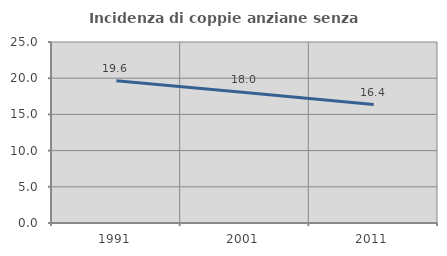
| Category | Incidenza di coppie anziane senza figli  |
|---|---|
| 1991.0 | 19.643 |
| 2001.0 | 18.033 |
| 2011.0 | 16.364 |